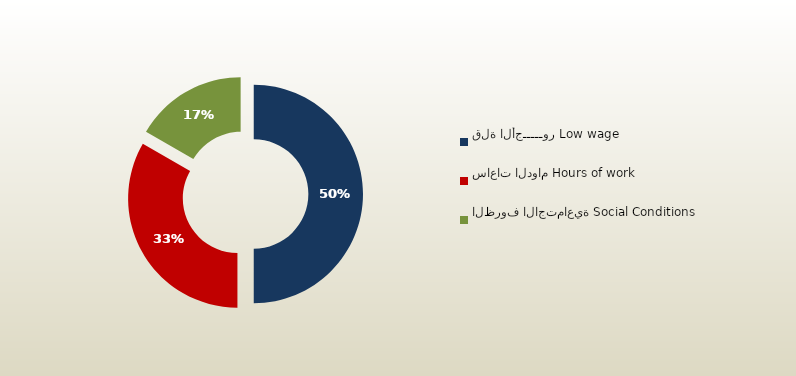
| Category | المجموع
Total |
|---|---|
| قلة الأجـــــور Low wage | 189 |
| ساعات الدوام Hours of work | 126 |
| الظروف الاجتماعية Social Conditions | 63 |